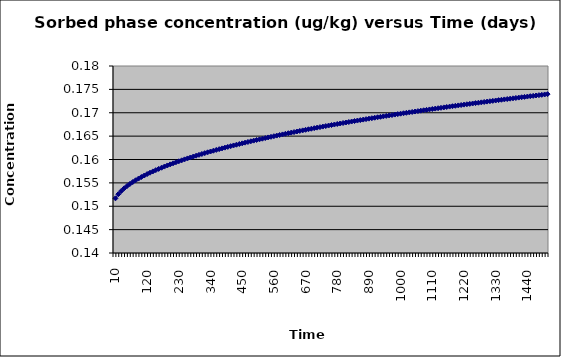
| Category | Series 0 |
|---|---|
| 10.0 | 0.152 |
| 20.0 | 0.153 |
| 30.0 | 0.153 |
| 40.0 | 0.154 |
| 50.0 | 0.154 |
| 60.0 | 0.155 |
| 70.0 | 0.155 |
| 80.0 | 0.156 |
| 90.0 | 0.156 |
| 100.0 | 0.156 |
| 110.0 | 0.157 |
| 120.0 | 0.157 |
| 130.0 | 0.157 |
| 140.0 | 0.157 |
| 150.0 | 0.158 |
| 160.0 | 0.158 |
| 170.0 | 0.158 |
| 180.0 | 0.158 |
| 190.0 | 0.159 |
| 200.0 | 0.159 |
| 210.0 | 0.159 |
| 220.0 | 0.159 |
| 230.0 | 0.16 |
| 240.0 | 0.16 |
| 250.0 | 0.16 |
| 260.0 | 0.16 |
| 270.0 | 0.16 |
| 280.0 | 0.161 |
| 290.0 | 0.161 |
| 300.0 | 0.161 |
| 310.0 | 0.161 |
| 320.0 | 0.161 |
| 330.0 | 0.162 |
| 340.0 | 0.162 |
| 350.0 | 0.162 |
| 360.0 | 0.162 |
| 370.0 | 0.162 |
| 380.0 | 0.162 |
| 390.0 | 0.163 |
| 400.0 | 0.163 |
| 410.0 | 0.163 |
| 420.0 | 0.163 |
| 430.0 | 0.163 |
| 440.0 | 0.163 |
| 450.0 | 0.163 |
| 460.0 | 0.164 |
| 470.0 | 0.164 |
| 480.0 | 0.164 |
| 490.0 | 0.164 |
| 500.0 | 0.164 |
| 510.0 | 0.164 |
| 520.0 | 0.164 |
| 530.0 | 0.165 |
| 540.0 | 0.165 |
| 550.0 | 0.165 |
| 560.0 | 0.165 |
| 570.0 | 0.165 |
| 580.0 | 0.165 |
| 590.0 | 0.165 |
| 600.0 | 0.165 |
| 610.0 | 0.166 |
| 620.0 | 0.166 |
| 630.0 | 0.166 |
| 640.0 | 0.166 |
| 650.0 | 0.166 |
| 660.0 | 0.166 |
| 670.0 | 0.166 |
| 680.0 | 0.166 |
| 690.0 | 0.167 |
| 700.0 | 0.167 |
| 710.0 | 0.167 |
| 720.0 | 0.167 |
| 730.0 | 0.167 |
| 740.0 | 0.167 |
| 750.0 | 0.167 |
| 760.0 | 0.167 |
| 770.0 | 0.167 |
| 780.0 | 0.168 |
| 790.0 | 0.168 |
| 800.0 | 0.168 |
| 810.0 | 0.168 |
| 820.0 | 0.168 |
| 830.0 | 0.168 |
| 840.0 | 0.168 |
| 850.0 | 0.168 |
| 860.0 | 0.168 |
| 870.0 | 0.169 |
| 880.0 | 0.169 |
| 890.0 | 0.169 |
| 900.0 | 0.169 |
| 910.0 | 0.169 |
| 920.0 | 0.169 |
| 930.0 | 0.169 |
| 940.0 | 0.169 |
| 950.0 | 0.169 |
| 960.0 | 0.169 |
| 970.0 | 0.17 |
| 980.0 | 0.17 |
| 990.0 | 0.17 |
| 1000.0 | 0.17 |
| 1010.0 | 0.17 |
| 1020.0 | 0.17 |
| 1030.0 | 0.17 |
| 1040.0 | 0.17 |
| 1050.0 | 0.17 |
| 1060.0 | 0.17 |
| 1070.0 | 0.17 |
| 1080.0 | 0.171 |
| 1090.0 | 0.171 |
| 1100.0 | 0.171 |
| 1110.0 | 0.171 |
| 1120.0 | 0.171 |
| 1130.0 | 0.171 |
| 1140.0 | 0.171 |
| 1150.0 | 0.171 |
| 1160.0 | 0.171 |
| 1170.0 | 0.171 |
| 1180.0 | 0.171 |
| 1190.0 | 0.171 |
| 1200.0 | 0.172 |
| 1210.0 | 0.172 |
| 1220.0 | 0.172 |
| 1230.0 | 0.172 |
| 1240.0 | 0.172 |
| 1250.0 | 0.172 |
| 1260.0 | 0.172 |
| 1270.0 | 0.172 |
| 1280.0 | 0.172 |
| 1290.0 | 0.172 |
| 1300.0 | 0.172 |
| 1310.0 | 0.172 |
| 1320.0 | 0.173 |
| 1330.0 | 0.173 |
| 1340.0 | 0.173 |
| 1350.0 | 0.173 |
| 1360.0 | 0.173 |
| 1370.0 | 0.173 |
| 1380.0 | 0.173 |
| 1390.0 | 0.173 |
| 1400.0 | 0.173 |
| 1410.0 | 0.173 |
| 1420.0 | 0.173 |
| 1430.0 | 0.173 |
| 1440.0 | 0.173 |
| 1450.0 | 0.174 |
| 1460.0 | 0.174 |
| 1470.0 | 0.174 |
| 1480.0 | 0.174 |
| 1490.0 | 0.174 |
| 1500.0 | 0.174 |
| 1510.0 | 0.174 |